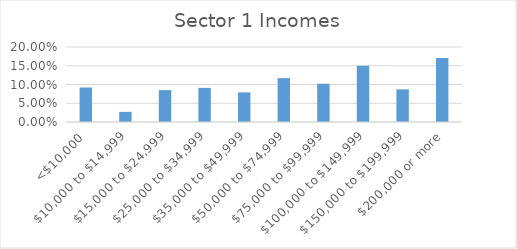
| Category | Series 0 |
|---|---|
| <$10,000 | 0.092 |
| $10,000 to $14,999 | 0.027 |
| $15,000 to $24,999 | 0.085 |
| $25,000 to $34,999 | 0.091 |
| $35,000 to $49,999 | 0.079 |
| $50,000 to $74,999 | 0.117 |
| $75,000 to $99,999 | 0.102 |
| $100,000 to $149,999 | 0.15 |
| $150,000 to $199,999 | 0.087 |
| $200,000 or more | 0.171 |